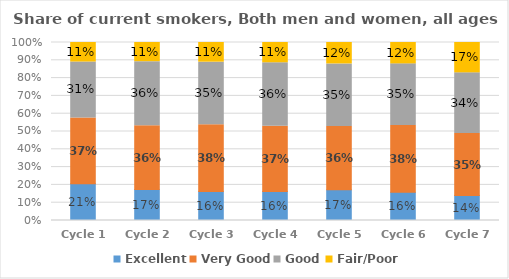
| Category | Excellent | Very Good | Good | Fair/Poor |
|---|---|---|---|---|
| Cycle 1 | 0.206 | 0.37 | 0.314 | 0.11 |
| Cycle 2 | 0.174 | 0.359 | 0.359 | 0.108 |
| Cycle 3 | 0.162 | 0.376 | 0.352 | 0.11 |
| Cycle 4 | 0.163 | 0.366 | 0.357 | 0.114 |
| Cycle 5 | 0.172 | 0.355 | 0.352 | 0.12 |
| Cycle 6 | 0.158 | 0.376 | 0.346 | 0.12 |
| Cycle 7 | 0.141 | 0.347 | 0.341 | 0.17 |